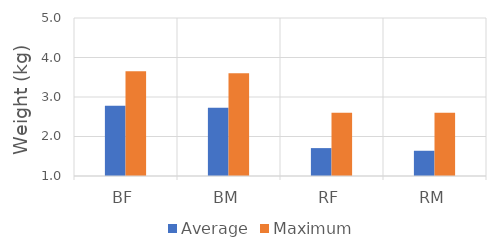
| Category | Average | Maximum |
|---|---|---|
| BF | 2.778 | 3.65 |
| BM | 2.73 | 3.6 |
| RF | 1.706 | 2.6 |
| RM | 1.639 | 2.6 |